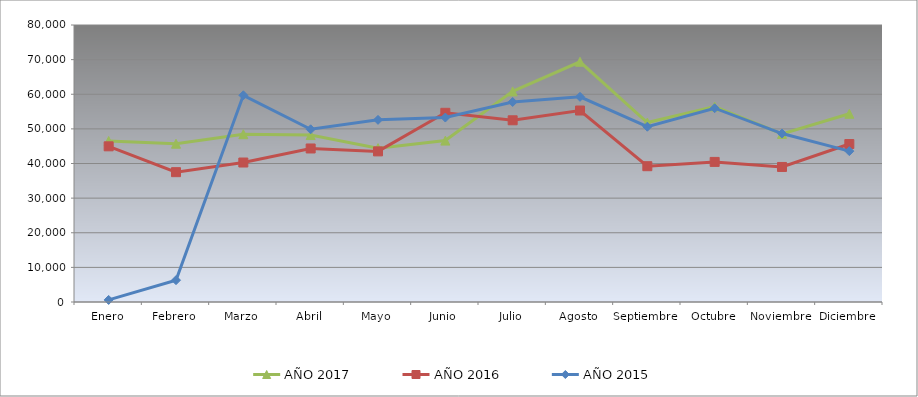
| Category | AÑO 2017 | AÑO 2016 | AÑO 2015 |
|---|---|---|---|
| Enero | 46500 | 44960 | 600 |
| Febrero | 45720 | 37500 | 6300 |
| Marzo | 48460 | 40280 | 59700 |
| Abril | 48220 | 44340 | 49880.895 |
| Mayo | 44440 | 43500 | 52606.798 |
| Junio | 46620 | 54640 | 53275.219 |
| Julio | 60820 | 52480 | 57766.17 |
| Agosto | 69380 | 55300 | 59259.673 |
| Septiembre | 51840 | 39220 | 50622.424 |
| Octubre | 56460 | 40460 | 55969.79 |
| Noviembre | 48540 | 39000 | 48648.494 |
| Diciembre | 54360 | 45620 | 43572.674 |